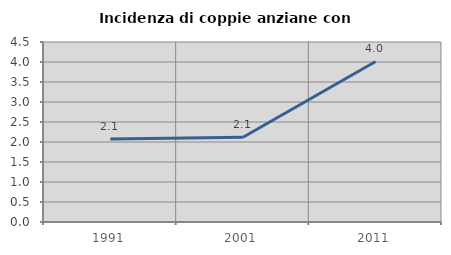
| Category | Incidenza di coppie anziane con figli |
|---|---|
| 1991.0 | 2.075 |
| 2001.0 | 2.12 |
| 2011.0 | 4.014 |